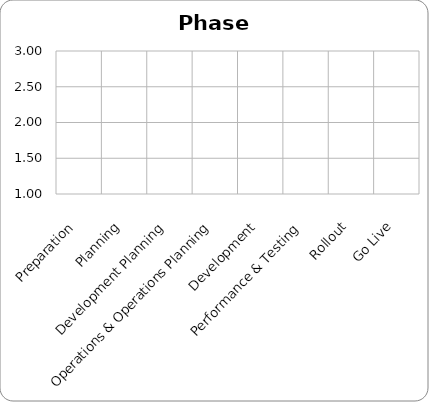
| Category | Series 0 |
|---|---|
| Preparation | 0 |
| Planning | 0 |
| Development Planning | 0 |
| Operations & Operations Planning | 0 |
| Development | 0 |
| Performance & Testing | 0 |
| Rollout | 0 |
| Go Live | 0 |